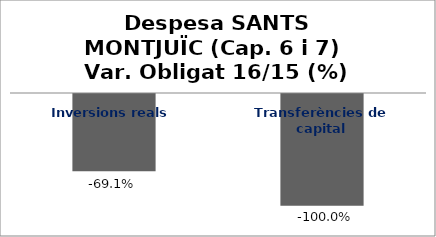
| Category | Series 0 |
|---|---|
| Inversions reals | -0.691 |
| Transferències de capital | -1 |